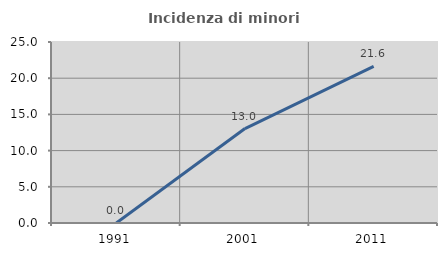
| Category | Incidenza di minori stranieri |
|---|---|
| 1991.0 | 0 |
| 2001.0 | 13.043 |
| 2011.0 | 21.622 |